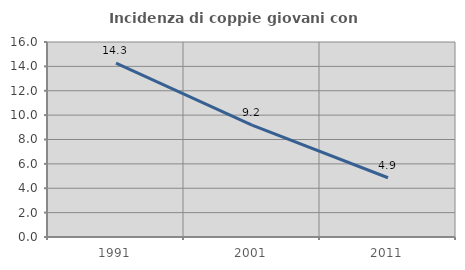
| Category | Incidenza di coppie giovani con figli |
|---|---|
| 1991.0 | 14.274 |
| 2001.0 | 9.174 |
| 2011.0 | 4.861 |